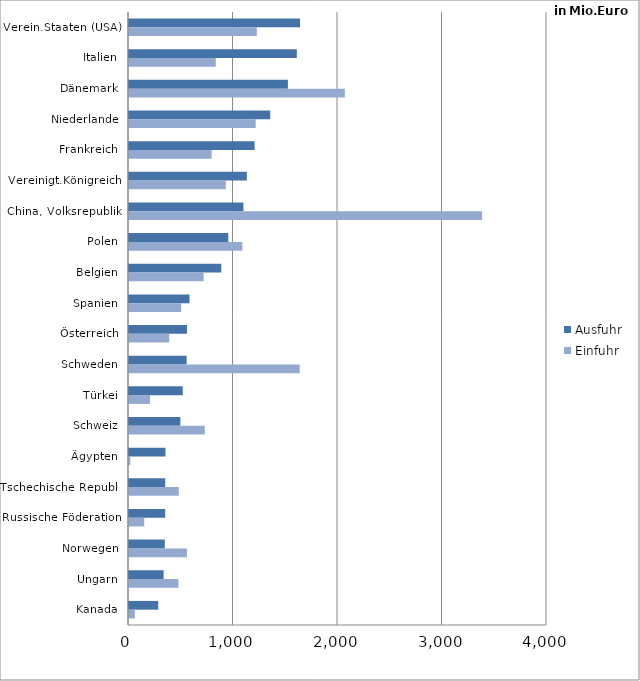
| Category | Ausfuhr | Einfuhr |
|---|---|---|
| Verein.Staaten (USA) | 1637.17 | 1222.917 |
| Italien | 1606.182 | 830.285 |
| Dänemark | 1520.55 | 2065.253 |
| Niederlande | 1351.664 | 1212.393 |
| Frankreich | 1202.155 | 790.228 |
| Vereinigt.Königreich | 1127.641 | 926.386 |
| China, Volksrepublik | 1094.81 | 3378.721 |
| Polen | 950.403 | 1084.94 |
| Belgien | 883.223 | 714.286 |
| Spanien | 579.083 | 499.128 |
| Österreich | 554.736 | 385.542 |
| Schweden | 551.088 | 1633.567 |
| Türkei | 514.5 | 201.34 |
| Schweiz | 491.404 | 725.149 |
| Ägypten | 349.138 | 12.301 |
| Tschechische Republ. | 346.777 | 475.984 |
| Russische Föderation | 346.61 | 145.776 |
| Norwegen | 342.66 | 554.329 |
| Ungarn | 331.494 | 472.461 |
| Kanada | 279.66 | 55.719 |